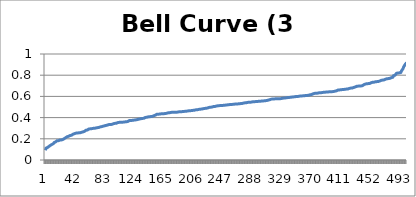
| Category | Bell Curve (3 dice) |
|---|---|
| 0 | 0.092 |
| 1 | 0.112 |
| 2 | 0.116 |
| 3 | 0.118 |
| 4 | 0.118 |
| 5 | 0.129 |
| 6 | 0.137 |
| 7 | 0.139 |
| 8 | 0.145 |
| 9 | 0.147 |
| 10 | 0.147 |
| 11 | 0.154 |
| 12 | 0.164 |
| 13 | 0.165 |
| 14 | 0.17 |
| 15 | 0.178 |
| 16 | 0.182 |
| 17 | 0.182 |
| 18 | 0.182 |
| 19 | 0.184 |
| 20 | 0.188 |
| 21 | 0.188 |
| 22 | 0.189 |
| 23 | 0.189 |
| 24 | 0.193 |
| 25 | 0.195 |
| 26 | 0.201 |
| 27 | 0.21 |
| 28 | 0.21 |
| 29 | 0.212 |
| 30 | 0.219 |
| 31 | 0.221 |
| 32 | 0.224 |
| 33 | 0.227 |
| 34 | 0.231 |
| 35 | 0.232 |
| 36 | 0.233 |
| 37 | 0.236 |
| 38 | 0.243 |
| 39 | 0.244 |
| 40 | 0.248 |
| 41 | 0.249 |
| 42 | 0.253 |
| 43 | 0.254 |
| 44 | 0.255 |
| 45 | 0.256 |
| 46 | 0.256 |
| 47 | 0.257 |
| 48 | 0.257 |
| 49 | 0.258 |
| 50 | 0.262 |
| 51 | 0.265 |
| 52 | 0.265 |
| 53 | 0.265 |
| 54 | 0.27 |
| 55 | 0.275 |
| 56 | 0.28 |
| 57 | 0.281 |
| 58 | 0.283 |
| 59 | 0.29 |
| 60 | 0.292 |
| 61 | 0.293 |
| 62 | 0.294 |
| 63 | 0.294 |
| 64 | 0.296 |
| 65 | 0.297 |
| 66 | 0.298 |
| 67 | 0.298 |
| 68 | 0.299 |
| 69 | 0.302 |
| 70 | 0.303 |
| 71 | 0.304 |
| 72 | 0.305 |
| 73 | 0.307 |
| 74 | 0.307 |
| 75 | 0.312 |
| 76 | 0.313 |
| 77 | 0.314 |
| 78 | 0.315 |
| 79 | 0.316 |
| 80 | 0.319 |
| 81 | 0.32 |
| 82 | 0.323 |
| 83 | 0.324 |
| 84 | 0.326 |
| 85 | 0.326 |
| 86 | 0.33 |
| 87 | 0.333 |
| 88 | 0.335 |
| 89 | 0.335 |
| 90 | 0.335 |
| 91 | 0.335 |
| 92 | 0.336 |
| 93 | 0.336 |
| 94 | 0.342 |
| 95 | 0.345 |
| 96 | 0.346 |
| 97 | 0.346 |
| 98 | 0.346 |
| 99 | 0.353 |
| 100 | 0.353 |
| 101 | 0.354 |
| 102 | 0.355 |
| 103 | 0.355 |
| 104 | 0.355 |
| 105 | 0.356 |
| 106 | 0.356 |
| 107 | 0.357 |
| 108 | 0.358 |
| 109 | 0.359 |
| 110 | 0.36 |
| 111 | 0.36 |
| 112 | 0.361 |
| 113 | 0.361 |
| 114 | 0.364 |
| 115 | 0.37 |
| 116 | 0.372 |
| 117 | 0.372 |
| 118 | 0.372 |
| 119 | 0.373 |
| 120 | 0.374 |
| 121 | 0.374 |
| 122 | 0.376 |
| 123 | 0.377 |
| 124 | 0.378 |
| 125 | 0.379 |
| 126 | 0.38 |
| 127 | 0.382 |
| 128 | 0.383 |
| 129 | 0.384 |
| 130 | 0.387 |
| 131 | 0.388 |
| 132 | 0.39 |
| 133 | 0.391 |
| 134 | 0.392 |
| 135 | 0.392 |
| 136 | 0.393 |
| 137 | 0.395 |
| 138 | 0.401 |
| 139 | 0.402 |
| 140 | 0.403 |
| 141 | 0.405 |
| 142 | 0.407 |
| 143 | 0.407 |
| 144 | 0.408 |
| 145 | 0.409 |
| 146 | 0.41 |
| 147 | 0.411 |
| 148 | 0.412 |
| 149 | 0.418 |
| 150 | 0.418 |
| 151 | 0.422 |
| 152 | 0.423 |
| 153 | 0.428 |
| 154 | 0.431 |
| 155 | 0.432 |
| 156 | 0.432 |
| 157 | 0.432 |
| 158 | 0.433 |
| 159 | 0.435 |
| 160 | 0.436 |
| 161 | 0.436 |
| 162 | 0.437 |
| 163 | 0.437 |
| 164 | 0.437 |
| 165 | 0.438 |
| 166 | 0.438 |
| 167 | 0.44 |
| 168 | 0.442 |
| 169 | 0.445 |
| 170 | 0.445 |
| 171 | 0.446 |
| 172 | 0.447 |
| 173 | 0.447 |
| 174 | 0.449 |
| 175 | 0.449 |
| 176 | 0.45 |
| 177 | 0.45 |
| 178 | 0.451 |
| 179 | 0.451 |
| 180 | 0.451 |
| 181 | 0.451 |
| 182 | 0.451 |
| 183 | 0.452 |
| 184 | 0.454 |
| 185 | 0.455 |
| 186 | 0.455 |
| 187 | 0.455 |
| 188 | 0.455 |
| 189 | 0.457 |
| 190 | 0.457 |
| 191 | 0.458 |
| 192 | 0.459 |
| 193 | 0.459 |
| 194 | 0.46 |
| 195 | 0.46 |
| 196 | 0.461 |
| 197 | 0.463 |
| 198 | 0.464 |
| 199 | 0.465 |
| 200 | 0.465 |
| 201 | 0.466 |
| 202 | 0.467 |
| 203 | 0.467 |
| 204 | 0.468 |
| 205 | 0.469 |
| 206 | 0.47 |
| 207 | 0.472 |
| 208 | 0.474 |
| 209 | 0.474 |
| 210 | 0.474 |
| 211 | 0.476 |
| 212 | 0.477 |
| 213 | 0.478 |
| 214 | 0.48 |
| 215 | 0.48 |
| 216 | 0.481 |
| 217 | 0.482 |
| 218 | 0.484 |
| 219 | 0.486 |
| 220 | 0.487 |
| 221 | 0.488 |
| 222 | 0.488 |
| 223 | 0.488 |
| 224 | 0.49 |
| 225 | 0.493 |
| 226 | 0.496 |
| 227 | 0.497 |
| 228 | 0.498 |
| 229 | 0.499 |
| 230 | 0.499 |
| 231 | 0.503 |
| 232 | 0.504 |
| 233 | 0.504 |
| 234 | 0.505 |
| 235 | 0.506 |
| 236 | 0.508 |
| 237 | 0.509 |
| 238 | 0.511 |
| 239 | 0.512 |
| 240 | 0.513 |
| 241 | 0.514 |
| 242 | 0.514 |
| 243 | 0.514 |
| 244 | 0.514 |
| 245 | 0.514 |
| 246 | 0.516 |
| 247 | 0.517 |
| 248 | 0.517 |
| 249 | 0.517 |
| 250 | 0.518 |
| 251 | 0.518 |
| 252 | 0.521 |
| 253 | 0.522 |
| 254 | 0.522 |
| 255 | 0.523 |
| 256 | 0.523 |
| 257 | 0.523 |
| 258 | 0.524 |
| 259 | 0.525 |
| 260 | 0.525 |
| 261 | 0.526 |
| 262 | 0.528 |
| 263 | 0.528 |
| 264 | 0.528 |
| 265 | 0.529 |
| 266 | 0.529 |
| 267 | 0.53 |
| 268 | 0.531 |
| 269 | 0.532 |
| 270 | 0.533 |
| 271 | 0.533 |
| 272 | 0.533 |
| 273 | 0.534 |
| 274 | 0.538 |
| 275 | 0.539 |
| 276 | 0.54 |
| 277 | 0.54 |
| 278 | 0.541 |
| 279 | 0.542 |
| 280 | 0.544 |
| 281 | 0.545 |
| 282 | 0.545 |
| 283 | 0.545 |
| 284 | 0.546 |
| 285 | 0.547 |
| 286 | 0.548 |
| 287 | 0.548 |
| 288 | 0.55 |
| 289 | 0.55 |
| 290 | 0.551 |
| 291 | 0.551 |
| 292 | 0.551 |
| 293 | 0.552 |
| 294 | 0.553 |
| 295 | 0.554 |
| 296 | 0.555 |
| 297 | 0.555 |
| 298 | 0.555 |
| 299 | 0.556 |
| 300 | 0.557 |
| 301 | 0.557 |
| 302 | 0.558 |
| 303 | 0.559 |
| 304 | 0.559 |
| 305 | 0.561 |
| 306 | 0.562 |
| 307 | 0.564 |
| 308 | 0.565 |
| 309 | 0.567 |
| 310 | 0.569 |
| 311 | 0.569 |
| 312 | 0.574 |
| 313 | 0.575 |
| 314 | 0.576 |
| 315 | 0.576 |
| 316 | 0.576 |
| 317 | 0.577 |
| 318 | 0.577 |
| 319 | 0.577 |
| 320 | 0.577 |
| 321 | 0.578 |
| 322 | 0.578 |
| 323 | 0.578 |
| 324 | 0.578 |
| 325 | 0.579 |
| 326 | 0.58 |
| 327 | 0.583 |
| 328 | 0.583 |
| 329 | 0.583 |
| 330 | 0.584 |
| 331 | 0.585 |
| 332 | 0.586 |
| 333 | 0.587 |
| 334 | 0.588 |
| 335 | 0.589 |
| 336 | 0.59 |
| 337 | 0.59 |
| 338 | 0.591 |
| 339 | 0.593 |
| 340 | 0.593 |
| 341 | 0.593 |
| 342 | 0.595 |
| 343 | 0.596 |
| 344 | 0.596 |
| 345 | 0.596 |
| 346 | 0.599 |
| 347 | 0.599 |
| 348 | 0.599 |
| 349 | 0.6 |
| 350 | 0.601 |
| 351 | 0.601 |
| 352 | 0.604 |
| 353 | 0.604 |
| 354 | 0.605 |
| 355 | 0.605 |
| 356 | 0.605 |
| 357 | 0.606 |
| 358 | 0.606 |
| 359 | 0.607 |
| 360 | 0.609 |
| 361 | 0.609 |
| 362 | 0.61 |
| 363 | 0.611 |
| 364 | 0.612 |
| 365 | 0.613 |
| 366 | 0.616 |
| 367 | 0.617 |
| 368 | 0.619 |
| 369 | 0.623 |
| 370 | 0.625 |
| 371 | 0.625 |
| 372 | 0.629 |
| 373 | 0.629 |
| 374 | 0.629 |
| 375 | 0.629 |
| 376 | 0.631 |
| 377 | 0.633 |
| 378 | 0.634 |
| 379 | 0.634 |
| 380 | 0.635 |
| 381 | 0.636 |
| 382 | 0.636 |
| 383 | 0.638 |
| 384 | 0.638 |
| 385 | 0.639 |
| 386 | 0.64 |
| 387 | 0.641 |
| 388 | 0.641 |
| 389 | 0.641 |
| 390 | 0.642 |
| 391 | 0.643 |
| 392 | 0.643 |
| 393 | 0.643 |
| 394 | 0.644 |
| 395 | 0.644 |
| 396 | 0.645 |
| 397 | 0.645 |
| 398 | 0.646 |
| 399 | 0.648 |
| 400 | 0.649 |
| 401 | 0.65 |
| 402 | 0.652 |
| 403 | 0.659 |
| 404 | 0.66 |
| 405 | 0.66 |
| 406 | 0.661 |
| 407 | 0.661 |
| 408 | 0.663 |
| 409 | 0.664 |
| 410 | 0.664 |
| 411 | 0.665 |
| 412 | 0.665 |
| 413 | 0.666 |
| 414 | 0.668 |
| 415 | 0.668 |
| 416 | 0.669 |
| 417 | 0.67 |
| 418 | 0.67 |
| 419 | 0.673 |
| 420 | 0.675 |
| 421 | 0.678 |
| 422 | 0.679 |
| 423 | 0.679 |
| 424 | 0.679 |
| 425 | 0.683 |
| 426 | 0.685 |
| 427 | 0.689 |
| 428 | 0.689 |
| 429 | 0.69 |
| 430 | 0.695 |
| 431 | 0.696 |
| 432 | 0.697 |
| 433 | 0.698 |
| 434 | 0.698 |
| 435 | 0.698 |
| 436 | 0.699 |
| 437 | 0.701 |
| 438 | 0.702 |
| 439 | 0.705 |
| 440 | 0.711 |
| 441 | 0.715 |
| 442 | 0.717 |
| 443 | 0.717 |
| 444 | 0.719 |
| 445 | 0.72 |
| 446 | 0.721 |
| 447 | 0.721 |
| 448 | 0.722 |
| 449 | 0.723 |
| 450 | 0.729 |
| 451 | 0.73 |
| 452 | 0.734 |
| 453 | 0.734 |
| 454 | 0.734 |
| 455 | 0.736 |
| 456 | 0.738 |
| 457 | 0.739 |
| 458 | 0.74 |
| 459 | 0.74 |
| 460 | 0.741 |
| 461 | 0.743 |
| 462 | 0.746 |
| 463 | 0.747 |
| 464 | 0.752 |
| 465 | 0.753 |
| 466 | 0.754 |
| 467 | 0.755 |
| 468 | 0.756 |
| 469 | 0.758 |
| 470 | 0.763 |
| 471 | 0.763 |
| 472 | 0.767 |
| 473 | 0.767 |
| 474 | 0.768 |
| 475 | 0.769 |
| 476 | 0.771 |
| 477 | 0.775 |
| 478 | 0.777 |
| 479 | 0.781 |
| 480 | 0.781 |
| 481 | 0.796 |
| 482 | 0.796 |
| 483 | 0.8 |
| 484 | 0.806 |
| 485 | 0.818 |
| 486 | 0.821 |
| 487 | 0.821 |
| 488 | 0.821 |
| 489 | 0.822 |
| 490 | 0.826 |
| 491 | 0.826 |
| 492 | 0.842 |
| 493 | 0.846 |
| 494 | 0.862 |
| 495 | 0.88 |
| 496 | 0.883 |
| 497 | 0.902 |
| 498 | 0.906 |
| 499 | 0.919 |